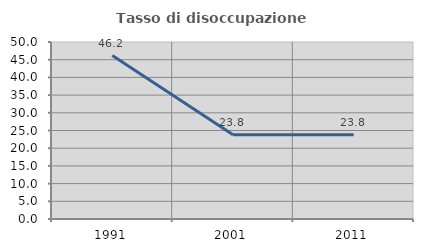
| Category | Tasso di disoccupazione giovanile  |
|---|---|
| 1991.0 | 46.154 |
| 2001.0 | 23.81 |
| 2011.0 | 23.81 |